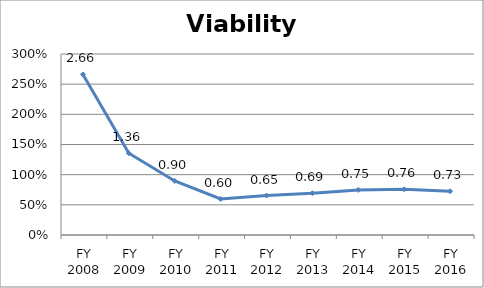
| Category | Viability ratio |
|---|---|
| FY 2016 | 0.725 |
| FY 2015 | 0.758 |
| FY 2014 | 0.747 |
| FY 2013 | 0.693 |
| FY 2012 | 0.654 |
| FY 2011 | 0.598 |
| FY 2010 | 0.896 |
| FY 2009 | 1.355 |
| FY 2008 | 2.662 |